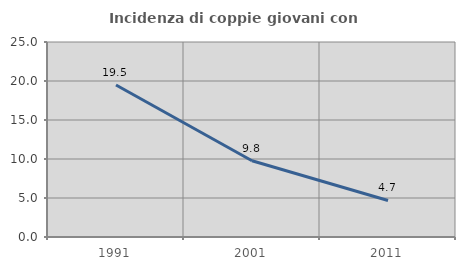
| Category | Incidenza di coppie giovani con figli |
|---|---|
| 1991.0 | 19.481 |
| 2001.0 | 9.774 |
| 2011.0 | 4.688 |